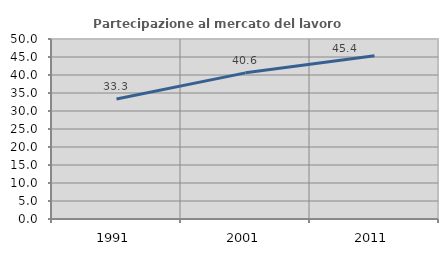
| Category | Partecipazione al mercato del lavoro  femminile |
|---|---|
| 1991.0 | 33.333 |
| 2001.0 | 40.598 |
| 2011.0 | 45.358 |